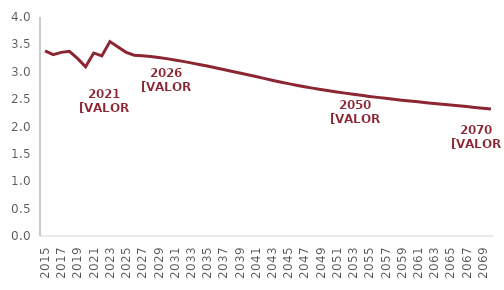
| Category | IIEE |
|---|---|
| 2015.0 | 3.382 |
| 2016.0 | 3.314 |
| 2017.0 | 3.354 |
| 2018.0 | 3.374 |
| 2019.0 | 3.243 |
| 2020.0 | 3.092 |
| 2021.0 | 3.343 |
| 2022.0 | 3.289 |
| 2023.0 | 3.551 |
| 2024.0 | 3.454 |
| 2025.0 | 3.355 |
| 2026.0 | 3.301 |
| 2027.0 | 3.292 |
| 2028.0 | 3.279 |
| 2029.0 | 3.261 |
| 2030.0 | 3.239 |
| 2031.0 | 3.216 |
| 2032.0 | 3.19 |
| 2033.0 | 3.162 |
| 2034.0 | 3.133 |
| 2035.0 | 3.104 |
| 2036.0 | 3.073 |
| 2037.0 | 3.042 |
| 2038.0 | 3.01 |
| 2039.0 | 2.978 |
| 2040.0 | 2.945 |
| 2041.0 | 2.912 |
| 2042.0 | 2.879 |
| 2043.0 | 2.846 |
| 2044.0 | 2.814 |
| 2045.0 | 2.783 |
| 2046.0 | 2.754 |
| 2047.0 | 2.726 |
| 2048.0 | 2.701 |
| 2049.0 | 2.677 |
| 2050.0 | 2.654 |
| 2051.0 | 2.631 |
| 2052.0 | 2.61 |
| 2053.0 | 2.589 |
| 2054.0 | 2.569 |
| 2055.0 | 2.55 |
| 2056.0 | 2.532 |
| 2057.0 | 2.514 |
| 2058.0 | 2.498 |
| 2059.0 | 2.482 |
| 2060.0 | 2.466 |
| 2061.0 | 2.45 |
| 2062.0 | 2.436 |
| 2063.0 | 2.421 |
| 2064.0 | 2.407 |
| 2065.0 | 2.393 |
| 2066.0 | 2.378 |
| 2067.0 | 2.364 |
| 2068.0 | 2.349 |
| 2069.0 | 2.334 |
| 2070.0 | 2.319 |